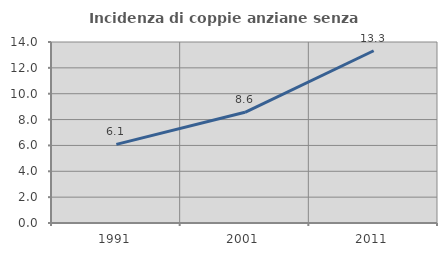
| Category | Incidenza di coppie anziane senza figli  |
|---|---|
| 1991.0 | 6.083 |
| 2001.0 | 8.562 |
| 2011.0 | 13.322 |